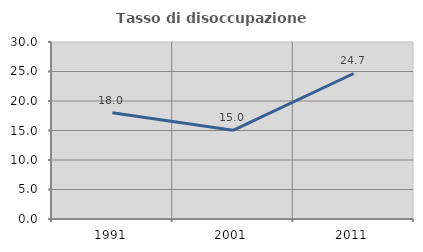
| Category | Tasso di disoccupazione giovanile  |
|---|---|
| 1991.0 | 17.991 |
| 2001.0 | 15.03 |
| 2011.0 | 24.664 |